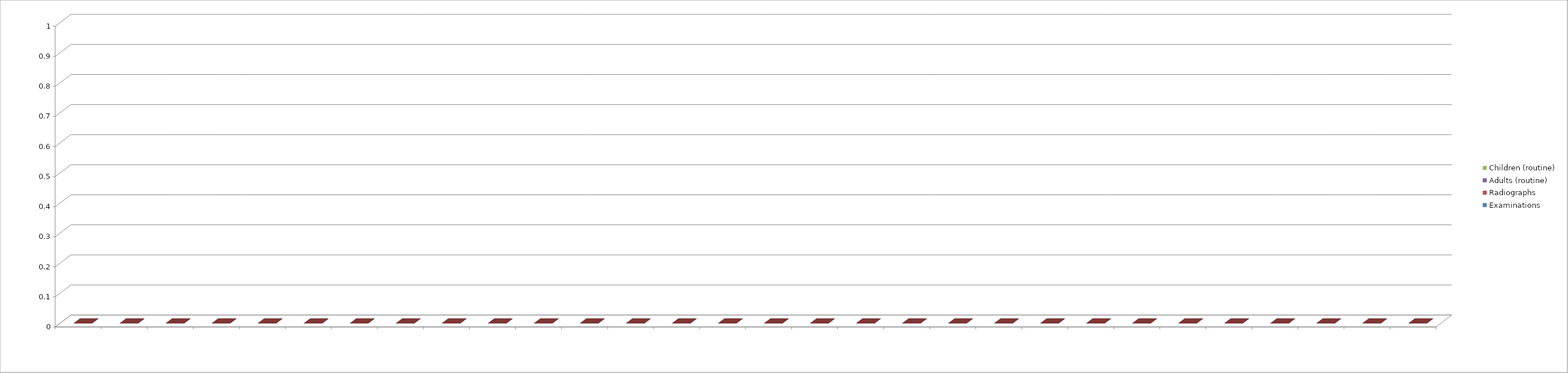
| Category | Examinations | Radiographs | Adults (routine) | Children (routine) |
|---|---|---|---|---|
| 0 | 0 | 0 | 0 | 0 |
| 1 | 0 | 0 | 0 | 0 |
| 2 | 0 | 0 | 0 | 0 |
| 3 | 0 | 0 | 0 | 0 |
| 4 | 0 | 0 | 0 | 0 |
| 5 | 0 | 0 | 0 | 0 |
| 6 | 0 | 0 | 0 | 0 |
| 7 | 0 | 0 | 0 | 0 |
| 8 | 0 | 0 | 0 | 0 |
| 9 | 0 | 0 | 0 | 0 |
| 10 | 0 | 0 | 0 | 0 |
| 11 | 0 | 0 | 0 | 0 |
| 12 | 0 | 0 | 0 | 0 |
| 13 | 0 | 0 | 0 | 0 |
| 14 | 0 | 0 | 0 | 0 |
| 15 | 0 | 0 | 0 | 0 |
| 16 | 0 | 0 | 0 | 0 |
| 17 | 0 | 0 | 0 | 0 |
| 18 | 0 | 0 | 0 | 0 |
| 19 | 0 | 0 | 0 | 0 |
| 20 | 0 | 0 | 0 | 0 |
| 21 | 0 | 0 | 0 | 0 |
| 22 | 0 | 0 | 0 | 0 |
| 23 | 0 | 0 | 0 | 0 |
| 24 | 0 | 0 | 0 | 0 |
| 25 | 0 | 0 | 0 | 0 |
| 26 | 0 | 0 | 0 | 0 |
| 27 | 0 | 0 | 0 | 0 |
| 28 | 0 | 0 | 0 | 0 |
| 29 | 0 | 0 | 0 | 0 |